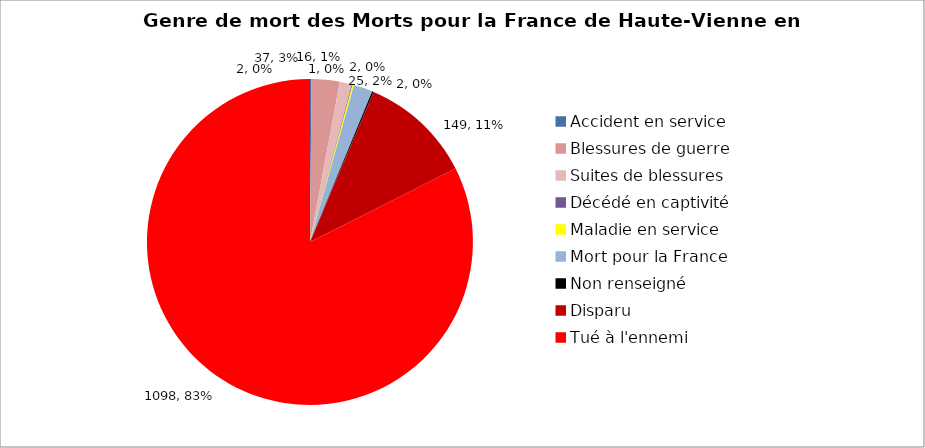
| Category | Genre de mort des Morts pour la France de Haute-Vienne en août 1914 |
|---|---|
| Accident en service | 2 |
| Blessures de guerre | 37 |
| Suites de blessures | 16 |
| Décédé en captivité | 1 |
| Maladie en service | 2 |
| Mort pour la France | 25 |
| Non renseigné | 2 |
| Disparu | 149 |
| Tué à l'ennemi | 1098 |